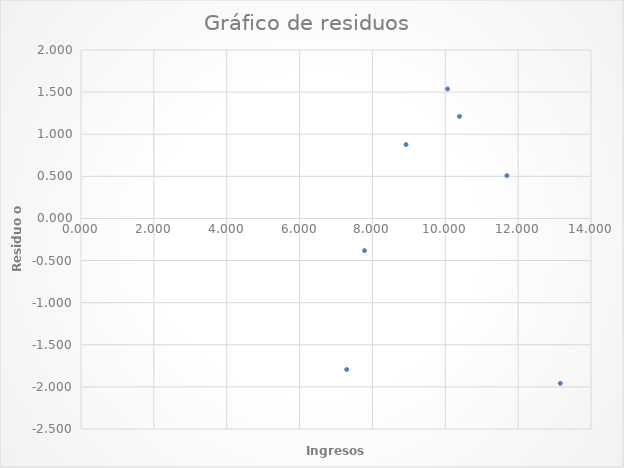
| Category | Series 0 |
|---|---|
| 7.293548387096776 | -1.794 |
| 7.782258064516132 | -0.382 |
| 8.922580645161293 | 0.877 |
| 10.062903225806455 | 1.537 |
| 10.388709677419357 | 1.211 |
| 11.691935483870969 | 0.508 |
| 13.158064516129034 | -1.958 |